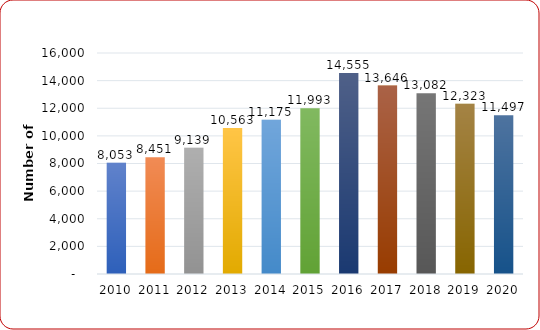
| Category | Total Graduates |
|---|---|
| 2010.0 | 8053 |
| 2011.0 | 8451 |
| 2012.0 | 9139 |
| 2013.0 | 10563 |
| 2014.0 | 11175 |
| 2015.0 | 11993 |
| 2016.0 | 14555 |
| 2017.0 | 13646 |
| 2018.0 | 13082 |
| 2019.0 | 12323 |
| 2020.0 | 11497 |